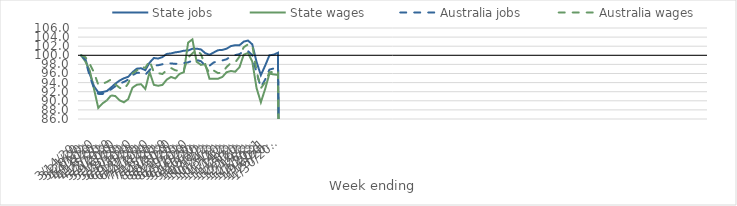
| Category | State jobs | State wages | Australia jobs | Australia wages |
|---|---|---|---|---|
| 14/03/2020 | 100 | 100 | 100 | 100 |
| 21/03/2020 | 99.169 | 98.622 | 98.956 | 99.595 |
| 28/03/2020 | 95.944 | 96.684 | 95.413 | 98.12 |
| 04/04/2020 | 93.192 | 92.627 | 92.814 | 96.244 |
| 11/04/2020 | 91.87 | 88.447 | 91.522 | 93.536 |
| 18/04/2020 | 91.916 | 89.43 | 91.5 | 93.735 |
| 25/04/2020 | 92.143 | 90.083 | 92.025 | 94.14 |
| 02/05/2020 | 92.928 | 91.193 | 92.519 | 94.693 |
| 09/05/2020 | 93.767 | 91.036 | 93.198 | 93.616 |
| 16/05/2020 | 94.454 | 90.097 | 93.788 | 92.845 |
| 23/05/2020 | 94.949 | 89.667 | 94.146 | 92.504 |
| 30/05/2020 | 95.277 | 90.366 | 94.65 | 93.808 |
| 06/06/2020 | 96.282 | 92.877 | 95.634 | 95.987 |
| 13/06/2020 | 97.056 | 93.53 | 96.135 | 96.641 |
| 20/06/2020 | 97.155 | 93.648 | 96.154 | 97.544 |
| 27/06/2020 | 96.739 | 92.607 | 95.728 | 97.236 |
| 04/07/2020 | 98.384 | 96.305 | 96.767 | 98.815 |
| 11/07/2020 | 99.411 | 93.51 | 97.729 | 96.243 |
| 18/07/2020 | 99.278 | 93.303 | 97.82 | 96.079 |
| 25/07/2020 | 99.612 | 93.493 | 98.028 | 95.887 |
| 01/08/2020 | 100.299 | 94.652 | 98.238 | 96.723 |
| 08/08/2020 | 100.421 | 95.245 | 98.223 | 97.204 |
| 15/08/2020 | 100.65 | 94.909 | 98.112 | 96.712 |
| 22/08/2020 | 100.78 | 95.914 | 98.158 | 96.554 |
| 29/08/2020 | 101.016 | 96.287 | 98.287 | 96.77 |
| 05/09/2020 | 101.048 | 102.781 | 98.443 | 99.477 |
| 12/09/2020 | 101.445 | 103.496 | 98.829 | 100.444 |
| 19/09/2020 | 101.463 | 98.573 | 98.97 | 101.162 |
| 26/09/2020 | 101.285 | 97.894 | 98.7 | 100.248 |
| 03/10/2020 | 100.477 | 98.075 | 97.765 | 97.757 |
| 10/10/2020 | 100.11 | 94.826 | 97.711 | 96.071 |
| 17/10/2020 | 100.631 | 94.869 | 98.435 | 96.645 |
| 24/10/2020 | 101.122 | 94.857 | 98.68 | 96.08 |
| 31/10/2020 | 101.186 | 95.244 | 98.863 | 96.206 |
| 07/11/2020 | 101.458 | 96.287 | 99.129 | 97.432 |
| 14/11/2020 | 102.024 | 96.545 | 99.776 | 98.33 |
| 21/11/2020 | 102.216 | 96.39 | 100.039 | 98.416 |
| 28/11/2020 | 102.207 | 97.378 | 100.264 | 99.694 |
| 05/12/2020 | 103.006 | 100.127 | 100.878 | 101.784 |
| 12/12/2020 | 103.242 | 100.52 | 100.916 | 102.402 |
| 19/12/2020 | 102.396 | 98.597 | 100.035 | 102.249 |
| 26/12/2020 | 98.538 | 92.794 | 96.089 | 96.528 |
| 02/01/2021 | 95.636 | 89.67 | 92.998 | 92.765 |
| 09/01/2021 | 97.712 | 92.583 | 94.651 | 94.062 |
| 16/01/2021 | 99.991 | 95.963 | 96.853 | 96.284 |
| 23/01/2021 | 100.138 | 95.802 | 97.109 | 96.336 |
| 30/01/2021 | 100.558 | 95.693 | 98.068 | 96.635 |